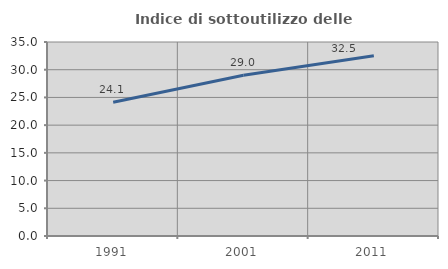
| Category | Indice di sottoutilizzo delle abitazioni  |
|---|---|
| 1991.0 | 24.128 |
| 2001.0 | 29.015 |
| 2011.0 | 32.52 |